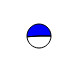
| Category | Series 0 |
|---|---|
| 0 | 18988 |
| 1 | 19780 |